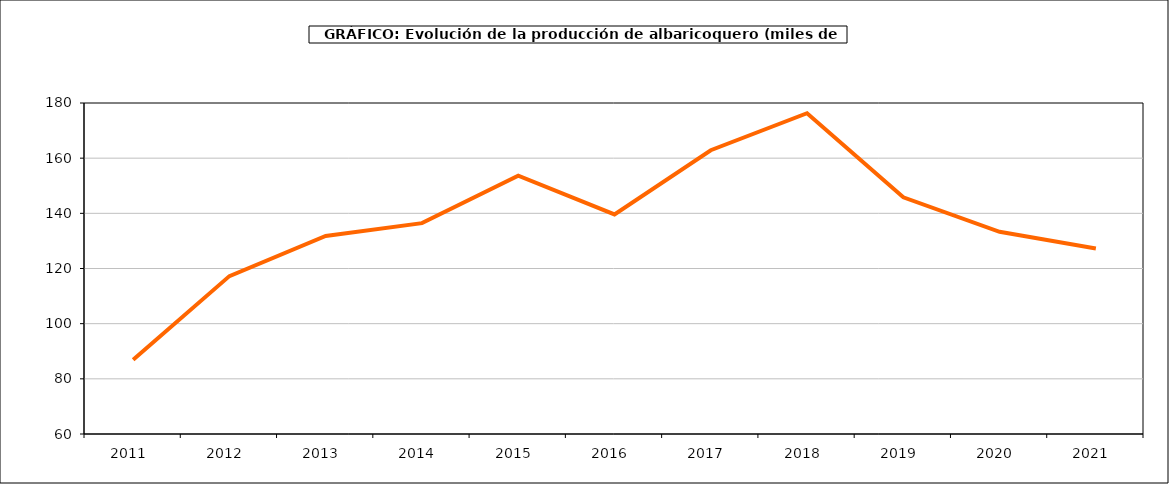
| Category | producción albaricoquero |
|---|---|
| 2011.0 | 86.88 |
| 2012.0 | 117.24 |
| 2013.0 | 131.776 |
| 2014.0 | 136.446 |
| 2015.0 | 153.667 |
| 2016.0 | 139.605 |
| 2017.0 | 162.872 |
| 2018.0 | 176.289 |
| 2019.0 | 145.826 |
| 2020.0 | 133.296 |
| 2021.0 | 127.231 |